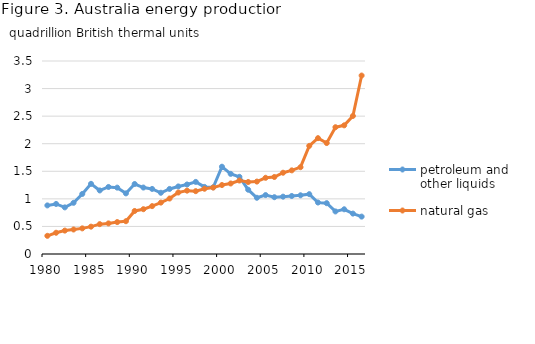
| Category | petroleum and other liquids | natural gas |
|---|---|---|
| 1980.0 | 0.881 | 0.33 |
| 1981.0 | 0.907 | 0.385 |
| 1982.0 | 0.845 | 0.424 |
| 1983.0 | 0.928 | 0.444 |
| 1984.0 | 1.089 | 0.465 |
| 1985.0 | 1.272 | 0.496 |
| 1986.0 | 1.153 | 0.541 |
| 1987.0 | 1.215 | 0.555 |
| 1988.0 | 1.204 | 0.579 |
| 1989.0 | 1.099 | 0.595 |
| 1990.0 | 1.269 | 0.78 |
| 1991.0 | 1.205 | 0.812 |
| 1992.0 | 1.18 | 0.868 |
| 1993.0 | 1.11 | 0.932 |
| 1994.0 | 1.18 | 1.006 |
| 1995.0 | 1.225 | 1.115 |
| 1996.0 | 1.26 | 1.149 |
| 1997.0 | 1.307 | 1.14 |
| 1998.0 | 1.217 | 1.183 |
| 1999.0 | 1.21 | 1.205 |
| 2000.0 | 1.583 | 1.251 |
| 2001.0 | 1.454 | 1.279 |
| 2002.0 | 1.4 | 1.333 |
| 2003.0 | 1.166 | 1.306 |
| 2004.0 | 1.02 | 1.313 |
| 2005.0 | 1.069 | 1.382 |
| 2006.0 | 1.03 | 1.397 |
| 2007.0 | 1.04 | 1.474 |
| 2008.0 | 1.052 | 1.517 |
| 2009.0 | 1.065 | 1.575 |
| 2010.0 | 1.085 | 1.961 |
| 2011.0 | 0.934 | 2.101 |
| 2012.0 | 0.922 | 2.012 |
| 2013.0 | 0.772 | 2.299 |
| 2014.0 | 0.811 | 2.333 |
| 2015.0 | 0.733 | 2.503 |
| 2016.0 | 0.678 | 3.236 |